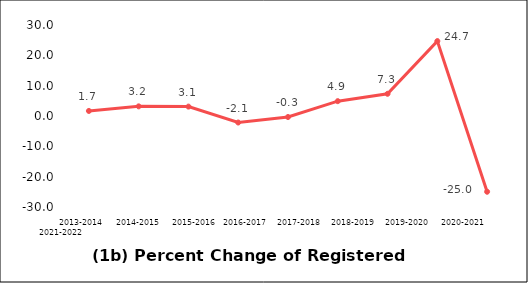
| Category | Series 0 |
|---|---|
| 2013-2014 | 1.668 |
| 2014-2015 | 3.177 |
| 2015-2016 | 3.098 |
| 2016-2017 | -2.15 |
| 2017-2018 | -0.336 |
| 2018-2019 | 4.891 |
| 2019-2020 | 7.323 |
| 2020-2021 | 24.685 |
| 2021-2022 | -24.968 |